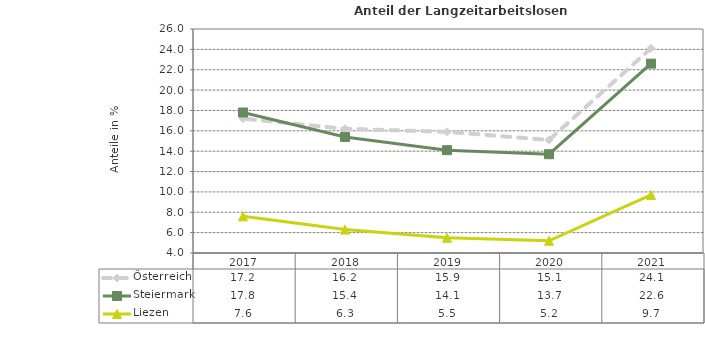
| Category | Österreich | Steiermark | Liezen |
|---|---|---|---|
| 2021.0 | 24.1 | 22.6 | 9.7 |
| 2020.0 | 15.1 | 13.7 | 5.2 |
| 2019.0 | 15.9 | 14.1 | 5.5 |
| 2018.0 | 16.2 | 15.4 | 6.3 |
| 2017.0 | 17.2 | 17.8 | 7.6 |